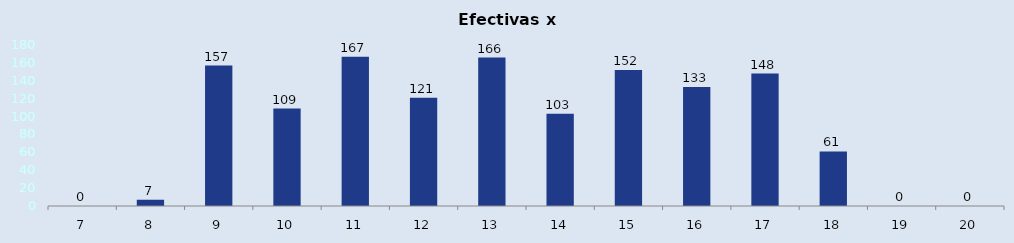
| Category | Cantidad |
|---|---|
| 7.0 | 0 |
| 8.0 | 7 |
| 9.0 | 157 |
| 10.0 | 109 |
| 11.0 | 167 |
| 12.0 | 121 |
| 13.0 | 166 |
| 14.0 | 103 |
| 15.0 | 152 |
| 16.0 | 133 |
| 17.0 | 148 |
| 18.0 | 61 |
| 19.0 | 0 |
| 20.0 | 0 |